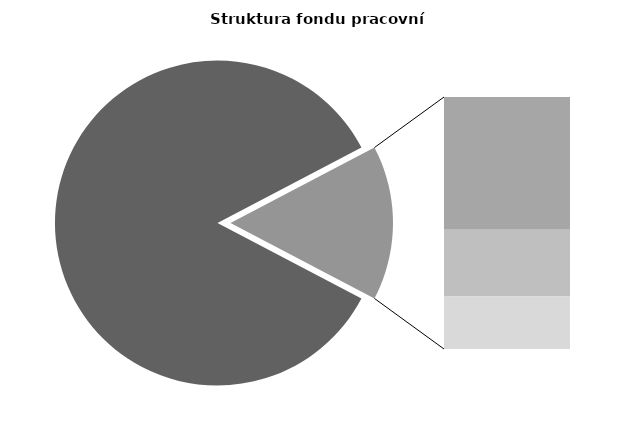
| Category | Series 0 |
|---|---|
| Průměrná měsíční odpracovaná doba bez přesčasu | 143.675 |
| Dovolená | 13.751 |
| Nemoc | 6.897 |
| Jiné | 5.44 |